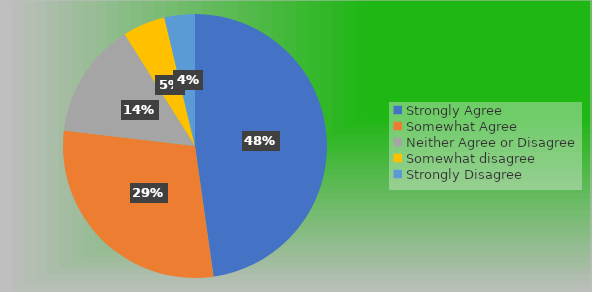
| Category | Series 0 |
|---|---|
| Strongly Agree | 64 |
| Somewhat Agree | 39 |
| Neither Agree or Disagree | 19 |
| Somewhat disagree | 7 |
| Strongly Disagree | 5 |